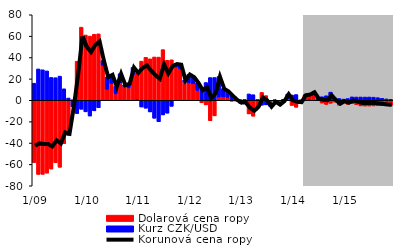
| Category | Dolarová cena ropy | Kurz CZK/USD |
|---|---|---|
|  1/09 | -58.318 | 16.006 |
| 2 | -69.4 | 29.347 |
| 3 | -69.287 | 28.538 |
| 4 | -68.163 | 27.498 |
| 5 | -64.354 | 21.394 |
| 6 | -58.395 | 21.136 |
| 7 | -62.697 | 22.603 |
| 8 | -40.548 | 10.781 |
| 9 | -33.074 | 2.13 |
| 10 | 0.318 | -6.15 |
| 11 | 36.53 | -12.428 |
| 12 | 68.408 | -8.414 |
|  1/10 | 61.08 | -10.819 |
| 2 | 60.085 | -14.734 |
| 3 | 61.793 | -9.884 |
| 4 | 62.185 | -6.995 |
| 5 | 32.816 | 4.415 |
| 6 | 10.283 | 11.518 |
| 7 | 15.804 | 8.178 |
| 8 | 5.946 | 7.054 |
| 9 | 16.357 | 8.533 |
| 10 | 13.142 | 1.183 |
| 11 | 11.513 | 4.148 |
| 12 | 24.174 | 6.662 |
|  1/11 | 25.824 | -0.03 |
| 2 | 36.638 | -6.295 |
| 3 | 40.235 | -7.426 |
| 4 | 38.796 | -10.894 |
| 5 | 40.539 | -16.816 |
| 6 | 40.4 | -20.074 |
| 7 | 47.416 | -13.691 |
| 8 | 37.414 | -12.066 |
| 9 | 37.886 | -5.648 |
| 10 | 31.121 | 2.958 |
| 11 | 29.402 | 4.114 |
| 12 | 17.064 | 1.772 |
|  1/12 | 16.222 | 8.082 |
| 2 | 15.381 | 6.478 |
| 3 | 9.236 | 7.28 |
| 4 | -2.371 | 12.081 |
| 5 | -4.311 | 16.622 |
| 6 | -19.138 | 21.271 |
| 7 | -14.578 | 21.302 |
| 8 | 2.986 | 19.252 |
| 9 | 3.073 | 7.922 |
| 10 | 2.659 | 5.82 |
| 11 | -0.919 | 5.323 |
| 12 | 1.358 | -0.697 |
|  1/13 | 0.76 | -2.775 |
| 2 | -2.527 | 0.711 |
| 3 | -12.763 | 5.955 |
| 4 | -14.903 | 5.242 |
| 5 | -6.4 | 0.658 |
| 6 | 7.375 | -4.582 |
| 7 | 4.382 | -4.295 |
| 8 | -1.902 | -3.867 |
| 9 | -1.58 | 0.387 |
| 10 | -1.827 | -2.047 |
| 11 | -1.496 | 0.91 |
| 12 | 1.439 | 4.413 |
|  1/14 | -4.869 | 4.979 |
| 2 | -6.569 | 5.353 |
| 3 | -1.639 | 0.061 |
| 4 | 4.659 | 0.306 |
| 5 | 5.585 | -0.03 |
| 6 | 5.371 | 2.351 |
| 7 | 0.796 | 0.872 |
| 8 | -2.615 | 3.329 |
| 9 | -3.907 | 4.24 |
| 10 | -2.823 | 7.637 |
| 11 | -1.707 | 2.043 |
| 12 | -4.626 | 1.644 |
|  1/15 | -1.764 | 1.084 |
| 2 | -3.73 | 1.626 |
| 3 | -3.205 | 3.193 |
| 4 | -4.081 | 3.066 |
| 5 | -5.263 | 3.062 |
| 6 | -5.387 | 3.023 |
| 7 | -5.377 | 3.066 |
| 8 | -5.279 | 2.905 |
| 9 | -5.173 | 2.46 |
| 10 | -5.092 | 1.84 |
| 11 | -5.035 | 1.275 |
| 12 | -4.973 | 0.875 |